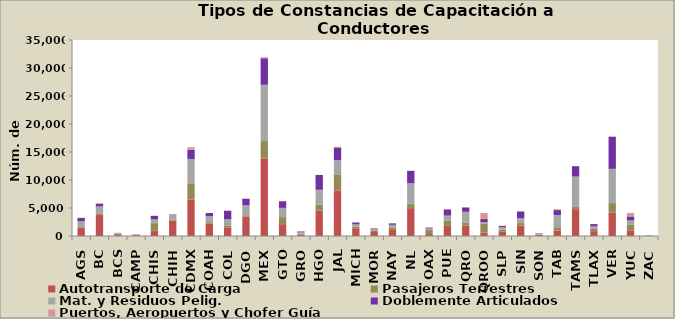
| Category | Autotransporte de Carga | Pasajeros Terrestres | Mat. y Residuos Pelig. | Doblemente Articulados | Puertos, Aeropuertos y Chofer Guía |
|---|---|---|---|---|---|
| AGS | 1425 | 152 | 1045 | 612 | 6 |
| BC | 3739 | 289 | 1248 | 494 | 43 |
| BCS | 168 | 203 | 117 | 0 | 90 |
| CAMP | 139 | 73 | 105 | 0 | 24 |
| CHIS | 932 | 1363 | 681 | 600 | 65 |
| CHIH | 2794 | 98 | 959 | 40 | 3 |
| CDMX | 6531 | 2776 | 4452 | 1662 | 441 |
| COAH | 2248 | 217 | 1078 | 564 | 0 |
| COL | 1555 | 244 | 1184 | 1507 | 68 |
| DGO | 3457 | 252 | 1786 | 1156 | 15 |
| MEX | 13870 | 3084 | 10053 | 4732 | 192 |
| GTO | 2115 | 1258 | 1649 | 1194 | 34 |
| GRO | 237 | 184 | 229 | 157 | 8 |
| HGO | 4503 | 1074 | 2679 | 2646 | 4 |
| JAL | 8151 | 2865 | 2520 | 2179 | 215 |
| MICH | 1264 | 427 | 387 | 337 | 1 |
| MOR | 714 | 302 | 269 | 85 | 4 |
| NAY | 1080 | 460 | 462 | 259 | 59 |
| NL | 4973 | 785 | 3657 | 2200 | 45 |
| OAX | 349 | 716 | 293 | 151 | 16 |
| PUE | 1812 | 887 | 939 | 1105 | 21 |
| QRO | 1849 | 493 | 1980 | 771 | 53 |
| QROO | 625 | 1624 | 231 | 544 | 1076 |
| SLP | 736 | 423 | 436 | 207 | 21 |
| SIN | 1856 | 455 | 852 | 1221 | 60 |
| SON | 198 | 17 | 150 | 82 | 1 |
| TAB | 944 | 621 | 2173 | 893 | 137 |
| TAMS | 4786 | 394 | 5430 | 1853 | 6 |
| TLAX | 870 | 382 | 463 | 408 | 3 |
| VER | 4208 | 1663 | 6119 | 5717 | 80 |
| YUC | 917 | 1062 | 800 | 715 | 614 |
| ZAC | 0 | 0 | 124 | 0 | 0 |